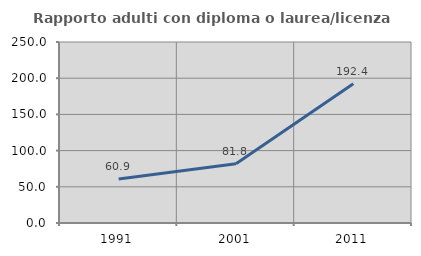
| Category | Rapporto adulti con diploma o laurea/licenza media  |
|---|---|
| 1991.0 | 60.866 |
| 2001.0 | 81.78 |
| 2011.0 | 192.436 |